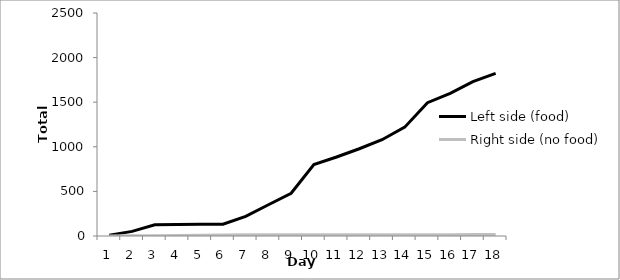
| Category | Left side (food) | Right side (no food) |
|---|---|---|
| 0 | 10 | 0 |
| 1 | 52 | 2 |
| 2 | 125 | 3 |
| 3 | 128 | 5 |
| 4 | 132 | 9 |
| 5 | 133 | 12 |
| 6 | 220 | 13 |
| 7 | 350 | 13 |
| 8 | 479 | 13 |
| 9 | 802 | 13 |
| 10 | 886 | 13 |
| 11 | 978 | 13 |
| 12 | 1079 | 13 |
| 13 | 1220 | 13 |
| 14 | 1494 | 14 |
| 15 | 1599 | 14 |
| 16 | 1731 | 18 |
| 17 | 1823 | 18 |